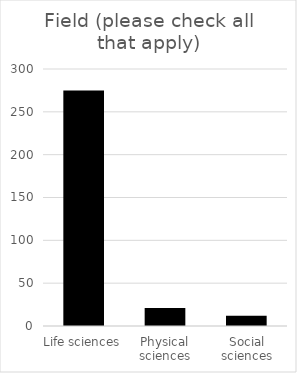
| Category | Field (please check all that apply) |
|---|---|
| Life sciences | 275 |
| Physical sciences | 21 |
| Social sciences | 12 |